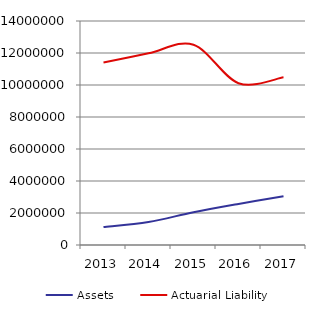
| Category |  Assets  |  Actuarial Liability  |
|---|---|---|
| 2013.0 | 1120014 | 11400758 |
| 2014.0 | 1441306 | 11978801 |
| 2015.0 | 2046725 | 12520108 |
| 2016.0 | 2566542 | 10109362 |
| 2017.0 | 3049204 | 10477968 |